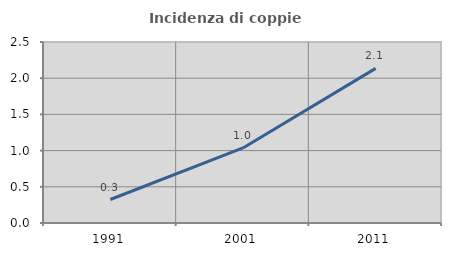
| Category | Incidenza di coppie miste |
|---|---|
| 1991.0 | 0.324 |
| 2001.0 | 1.036 |
| 2011.0 | 2.136 |